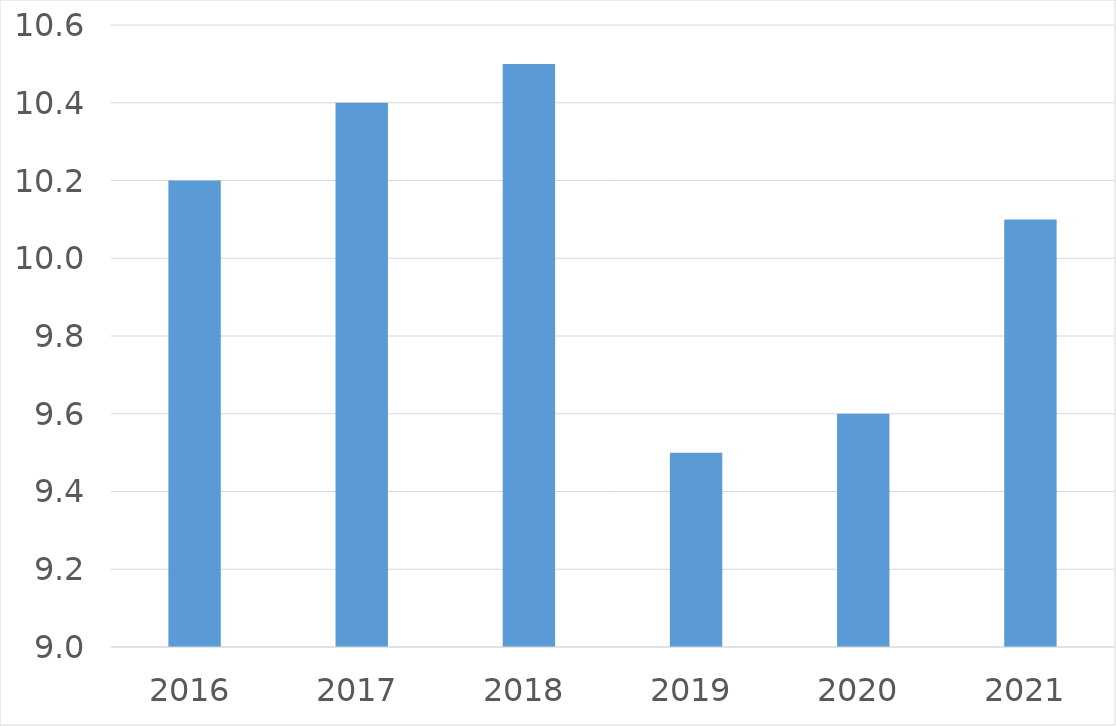
| Category | Series 0 |
|---|---|
| 2016 | 10.2 |
| 2017 | 10.4 |
| 2018 | 10.5 |
| 2019 | 9.5 |
| 2020 | 9.6 |
| 2021 | 10.1 |